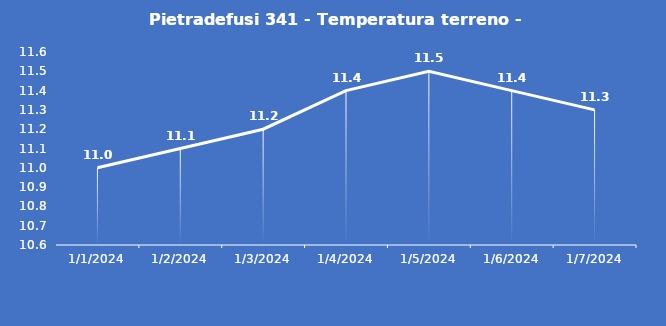
| Category | Pietradefusi 341 - Temperatura terreno - Grezzo (°C) |
|---|---|
| 1/1/24 | 11 |
| 1/2/24 | 11.1 |
| 1/3/24 | 11.2 |
| 1/4/24 | 11.4 |
| 1/5/24 | 11.5 |
| 1/6/24 | 11.4 |
| 1/7/24 | 11.3 |